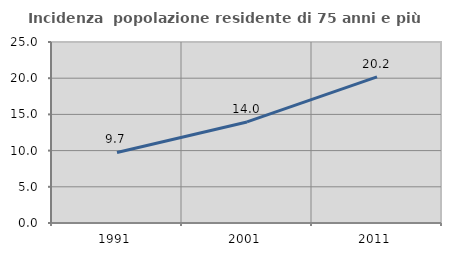
| Category | Incidenza  popolazione residente di 75 anni e più |
|---|---|
| 1991.0 | 9.744 |
| 2001.0 | 13.96 |
| 2011.0 | 20.191 |